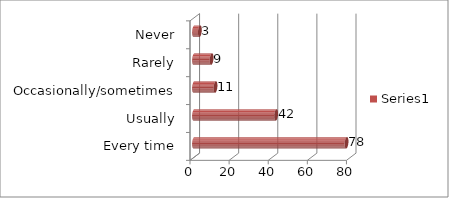
| Category | Series 0 |
|---|---|
| Every time | 78 |
| Usually | 42 |
| Occasionally/sometimes | 11 |
| Rarely | 9 |
| Never | 3 |